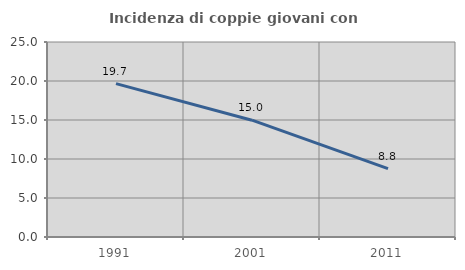
| Category | Incidenza di coppie giovani con figli |
|---|---|
| 1991.0 | 19.663 |
| 2001.0 | 14.975 |
| 2011.0 | 8.774 |